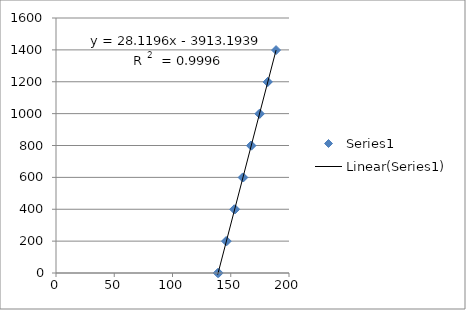
| Category | Series 0 |
|---|---|
| 138.8 | 0 |
| 145.9 | 199.8 |
| 152.9 | 399.6 |
| 160.2 | 599.4 |
| 167.3 | 799.2 |
| 174.5 | 999 |
| 181.7 | 1198.8 |
| 188.9 | 1398.6 |
| 181.8 | 1198.8 |
| 175.0 | 999 |
| 167.8 | 799.2 |
| 160.8 | 599.4 |
| 153.8 | 399.6 |
| 146.6 | 199.8 |
| 139.6 | 0 |